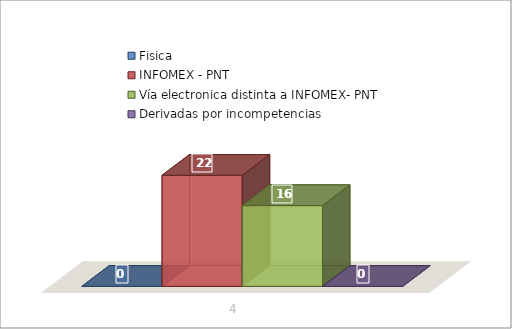
| Category | Fisica | INFOMEX - PNT | Vía electronica distinta a INFOMEX- PNT | Derivadas por incompetencias |
|---|---|---|---|---|
| 0 | 0 | 22 | 16 | 0 |